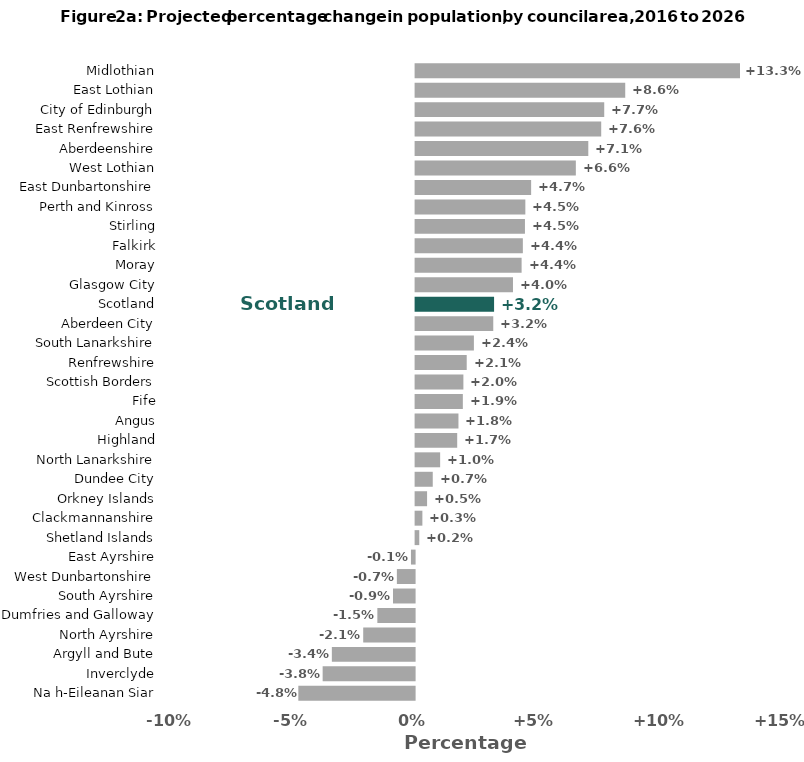
| Category | Series 0 |
|---|---|
| Na h-Eileanan Siar | -4.773 |
| Inverclyde | -3.775 |
| Argyll and Bute | -3.397 |
| North Ayrshire | -2.11 |
| Dumfries and Galloway | -1.529 |
| South Ayrshire | -0.887 |
| West Dunbartonshire | -0.728 |
| East Ayrshire | -0.15 |
| Shetland Islands | 0.151 |
| Clackmannanshire | 0.278 |
| Orkney Islands | 0.471 |
| Dundee City | 0.704 |
| North Lanarkshire | 1.008 |
| Highland | 1.708 |
| Angus | 1.759 |
| Fife | 1.939 |
| Scottish Borders | 1.962 |
| Renfrewshire | 2.099 |
| South Lanarkshire | 2.393 |
| Aberdeen City | 3.189 |
| Scotland | 3.222 |
| Glasgow City | 3.997 |
| Moray | 4.352 |
| Falkirk | 4.403 |
| Stirling | 4.489 |
| Perth and Kinross | 4.505 |
| East Dunbartonshire | 4.742 |
| West Lothian | 6.578 |
| Aberdeenshire | 7.09 |
| East Renfrewshire | 7.62 |
| City of Edinburgh | 7.744 |
| East Lothian | 8.606 |
| Midlothian | 13.317 |